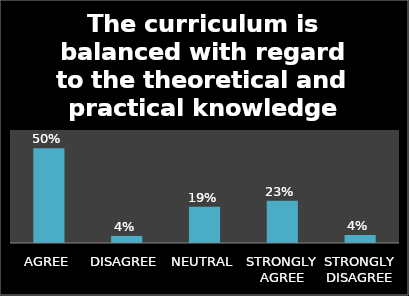
| Category | Series 0 |
|---|---|
| AGREE | 0.502 |
| DISAGREE | 0.038 |
| NEUTRAL | 0.192 |
| STRONGLY AGREE | 0.225 |
| STRONGLY DISAGREE | 0.042 |